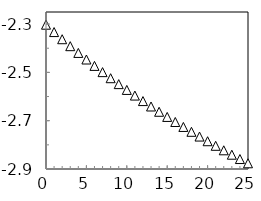
| Category | Series 2 |
|---|---|
| 0.0 | -2.303 |
| 1.0 | -2.333 |
| 2.0 | -2.363 |
| 3.0 | -2.392 |
| 4.0 | -2.419 |
| 5.0 | -2.447 |
| 6.0 | -2.473 |
| 7.0 | -2.499 |
| 8.0 | -2.524 |
| 9.0 | -2.549 |
| 10.0 | -2.573 |
| 11.0 | -2.596 |
| 12.0 | -2.619 |
| 13.0 | -2.641 |
| 14.0 | -2.663 |
| 15.0 | -2.684 |
| 16.0 | -2.705 |
| 17.0 | -2.726 |
| 18.0 | -2.746 |
| 19.0 | -2.766 |
| 20.0 | -2.785 |
| 21.0 | -2.804 |
| 22.0 | -2.823 |
| 23.0 | -2.841 |
| 24.0 | -2.859 |
| 25.0 | -2.876 |